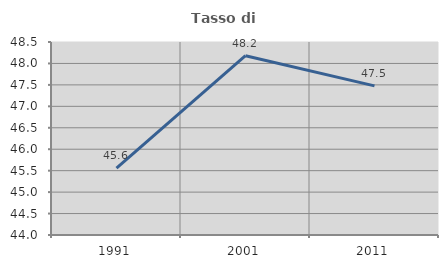
| Category | Tasso di occupazione   |
|---|---|
| 1991.0 | 45.559 |
| 2001.0 | 48.18 |
| 2011.0 | 47.476 |